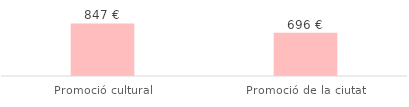
| Category | Total |
|---|---|
| Promoció cultural | 847 |
| Promoció de la ciutat | 695.75 |